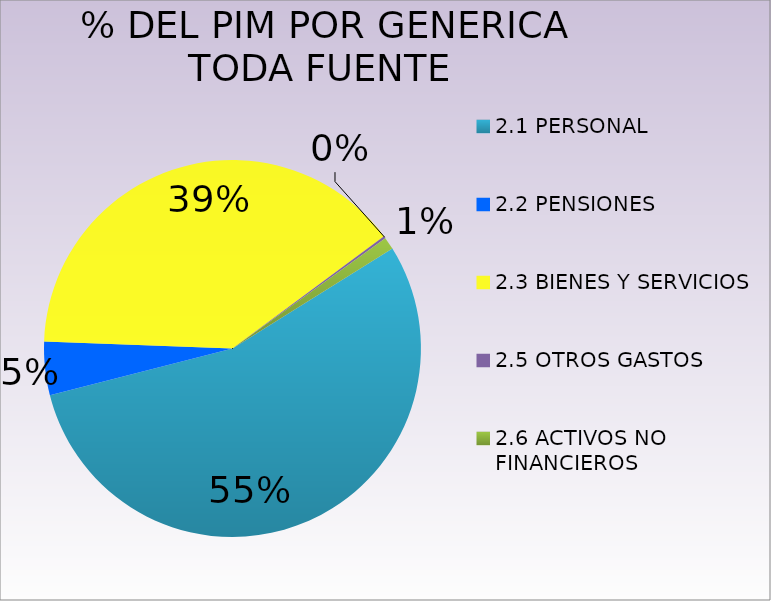
| Category | Series 0 |
|---|---|
| 2.1 PERSONAL | 34240163 |
| 2.2 PENSIONES | 2859078 |
| 2.3 BIENES Y SERVICIOS | 24486035 |
| 2.5 OTROS GASTOS  | 116374 |
| 2.6 ACTIVOS NO FINANCIEROS  | 664410 |